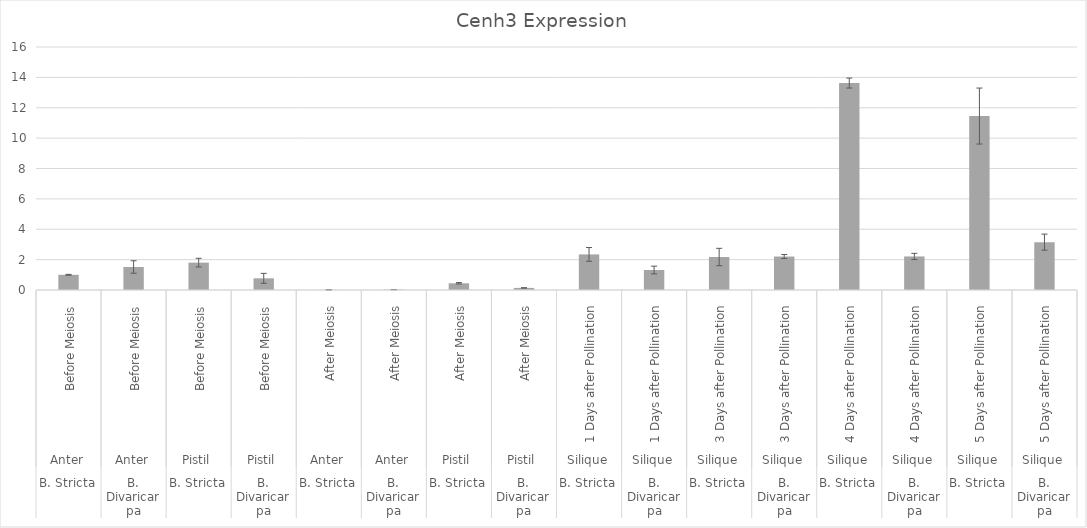
| Category | Series 0 |
|---|---|
| 0 | 1.001 |
| 1 | 1.515 |
| 2 | 1.801 |
| 3 | 0.769 |
| 4 | 0.008 |
| 5 | 0.023 |
| 6 | 0.441 |
| 7 | 0.138 |
| 8 | 2.344 |
| 9 | 1.316 |
| 10 | 2.172 |
| 11 | 2.203 |
| 12 | 13.627 |
| 13 | 2.209 |
| 14 | 11.452 |
| 15 | 3.151 |